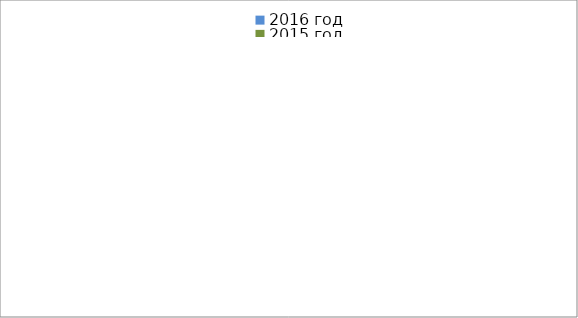
| Category | 2016 год | 2015 год |
|---|---|---|
|  - поджог | 9 | 2 |
|  - неосторожное обращение с огнём | 10 | 10 |
|  - НПТЭ электрооборудования | 4 | 2 |
|  - НПУ и Э печей | 14 | 10 |
|  - НПУ и Э транспортных средств | 5 | 19 |
|   -Шалость с огнем детей | 1 | 0 |
|  -НППБ при эксплуатации эл.приборов | 2 | 5 |
|  - курение | 0 | 3 |
| - прочие | 16 | 23 |
| - не установленные причины | 6 | 1 |